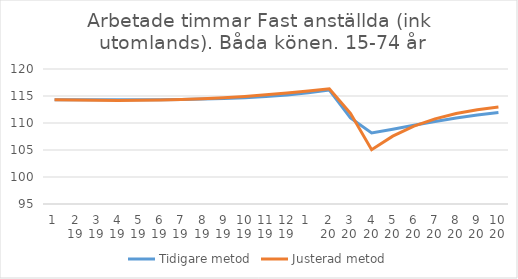
| Category | Tidigare metod | Justerad metod |
|---|---|---|
| 0 | 114.31 | 114.3 |
| 1 | 114.31 | 114.24 |
| 2 | 114.31 | 114.2 |
| 3 | 114.3 | 114.18 |
| 4 | 114.29 | 114.19 |
| 5 | 114.31 | 114.24 |
| 6 | 114.36 | 114.34 |
| 7 | 114.44 | 114.49 |
| 8 | 114.55 | 114.68 |
| 9 | 114.69 | 114.92 |
| 10 | 114.9 | 115.21 |
| 11 | 115.2 | 115.54 |
| 12 | 115.6 | 115.92 |
| 13 | 116.09 | 116.32 |
| 14 | 110.93 | 111.79 |
| 15 | 108.16 | 105.05 |
| 16 | 108.86 | 107.57 |
| 17 | 109.57 | 109.41 |
| 18 | 110.26 | 110.76 |
| 19 | 110.91 | 111.75 |
| 20 | 111.47 | 112.46 |
| 21 | 111.93 | 112.96 |